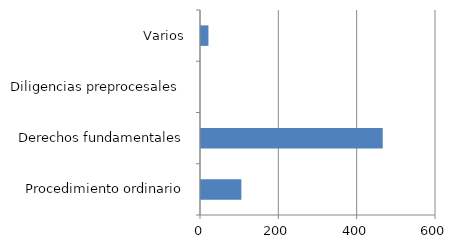
| Category | Series 0 |
|---|---|
| Procedimiento ordinario | 103 |
| Derechos fundamentales | 464 |
| Diligencias preprocesales  | 0 |
| Varios | 19 |